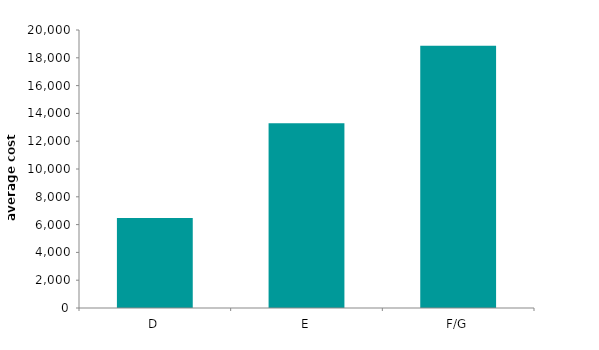
| Category | average cost |
|---|---|
| D | 6471.525 |
| E | 13284.778 |
| F/G | 18858.348 |